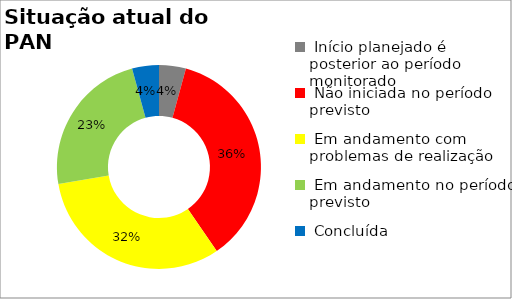
| Category | Series 0 |
|---|---|
|  Início planejado é posterior ao período monitorado | 0.043 |
|  Não iniciada no período previsto | 0.362 |
|  Em andamento com problemas de realização | 0.319 |
|  Em andamento no período previsto  | 0.234 |
|  Concluída | 0.043 |